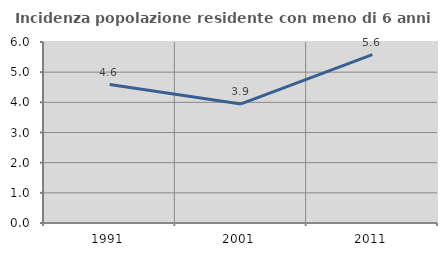
| Category | Incidenza popolazione residente con meno di 6 anni |
|---|---|
| 1991.0 | 4.591 |
| 2001.0 | 3.946 |
| 2011.0 | 5.584 |